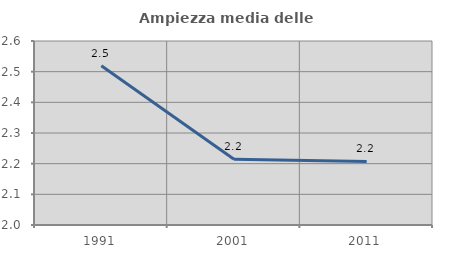
| Category | Ampiezza media delle famiglie |
|---|---|
| 1991.0 | 2.519 |
| 2001.0 | 2.214 |
| 2011.0 | 2.207 |